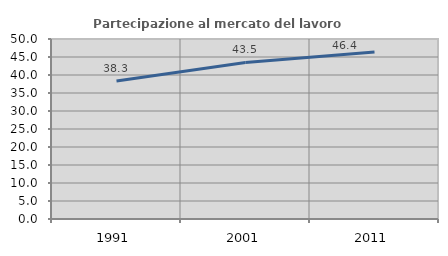
| Category | Partecipazione al mercato del lavoro  femminile |
|---|---|
| 1991.0 | 38.31 |
| 2001.0 | 43.492 |
| 2011.0 | 46.386 |